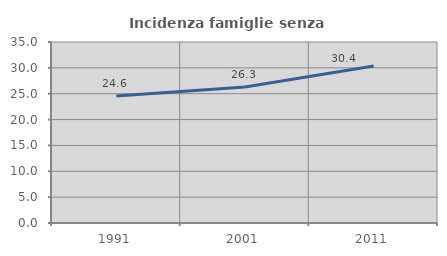
| Category | Incidenza famiglie senza nuclei |
|---|---|
| 1991.0 | 24.555 |
| 2001.0 | 26.299 |
| 2011.0 | 30.375 |